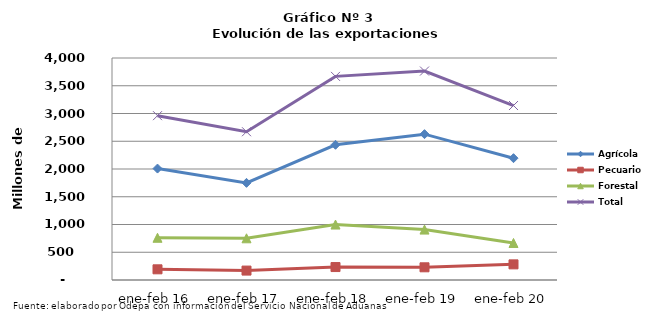
| Category | Agrícola | Pecuario | Forestal | Total |
|---|---|---|---|---|
| ene-feb 16 | 2007713 | 192404 | 760756 | 2960873 |
| ene-feb 17 | 1750137 | 169725 | 751657 | 2671519 |
| ene-feb 18 | 2436576 | 233250 | 999091 | 3668917 |
| ene-feb 19 | 2627898 | 228634 | 908332 | 3764864 |
| ene-feb 20 | 2195006 | 281614 | 667055 | 3143675 |